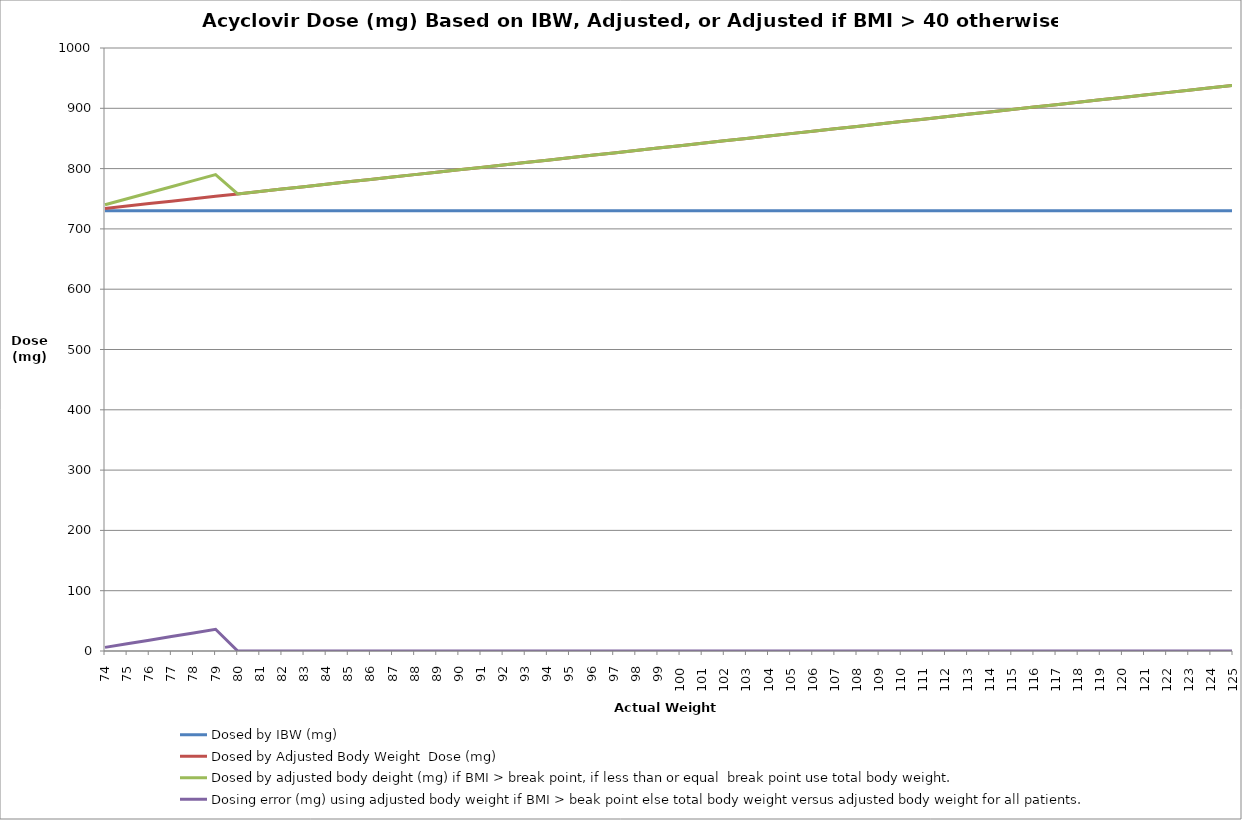
| Category | Dosed by IBW (mg) | Dosed by Adjusted Body Weight  Dose (mg) | Dosed by adjusted body deight (mg) if BMI > break point, if less than or equal  break point use total body weight. | Dosing error (mg) using adjusted body weight if BMI > beak point else total body weight versus adjusted body weight for all patients. |
|---|---|---|---|---|
| 74.0 | 730 | 734 | 740 | 6 |
| 75.0 | 730 | 738 | 750 | 12 |
| 76.0 | 730 | 742 | 760 | 18 |
| 77.0 | 730 | 746 | 770 | 24 |
| 78.0 | 730 | 750 | 780 | 30 |
| 79.0 | 730 | 754 | 790 | 36 |
| 80.0 | 730 | 758 | 758 | 0 |
| 81.0 | 730 | 762 | 762 | 0 |
| 82.0 | 730 | 766 | 766 | 0 |
| 83.0 | 730 | 770 | 770 | 0 |
| 84.0 | 730 | 774 | 774 | 0 |
| 85.0 | 730 | 778 | 778 | 0 |
| 86.0 | 730 | 782 | 782 | 0 |
| 87.0 | 730 | 786 | 786 | 0 |
| 88.0 | 730 | 790 | 790 | 0 |
| 89.0 | 730 | 794 | 794 | 0 |
| 90.0 | 730 | 798 | 798 | 0 |
| 91.0 | 730 | 802 | 802 | 0 |
| 92.0 | 730 | 806 | 806 | 0 |
| 93.0 | 730 | 810 | 810 | 0 |
| 94.0 | 730 | 814 | 814 | 0 |
| 95.0 | 730 | 818 | 818 | 0 |
| 96.0 | 730 | 822 | 822 | 0 |
| 97.0 | 730 | 826 | 826 | 0 |
| 98.0 | 730 | 830 | 830 | 0 |
| 99.0 | 730 | 834 | 834 | 0 |
| 100.0 | 730 | 838 | 838 | 0 |
| 101.0 | 730 | 842 | 842 | 0 |
| 102.0 | 730 | 846 | 846 | 0 |
| 103.0 | 730 | 850 | 850 | 0 |
| 104.0 | 730 | 854 | 854 | 0 |
| 105.0 | 730 | 858 | 858 | 0 |
| 106.0 | 730 | 862 | 862 | 0 |
| 107.0 | 730 | 866 | 866 | 0 |
| 108.0 | 730 | 870 | 870 | 0 |
| 109.0 | 730 | 874 | 874 | 0 |
| 110.0 | 730 | 878 | 878 | 0 |
| 111.0 | 730 | 882 | 882 | 0 |
| 112.0 | 730 | 886 | 886 | 0 |
| 113.0 | 730 | 890 | 890 | 0 |
| 114.0 | 730 | 894 | 894 | 0 |
| 115.0 | 730 | 898 | 898 | 0 |
| 116.0 | 730 | 902 | 902 | 0 |
| 117.0 | 730 | 906 | 906 | 0 |
| 118.0 | 730 | 910 | 910 | 0 |
| 119.0 | 730 | 914 | 914 | 0 |
| 120.0 | 730 | 918 | 918 | 0 |
| 121.0 | 730 | 922 | 922 | 0 |
| 122.0 | 730 | 926 | 926 | 0 |
| 123.0 | 730 | 930 | 930 | 0 |
| 124.0 | 730 | 934 | 934 | 0 |
| 125.0 | 730 | 938 | 938 | 0 |